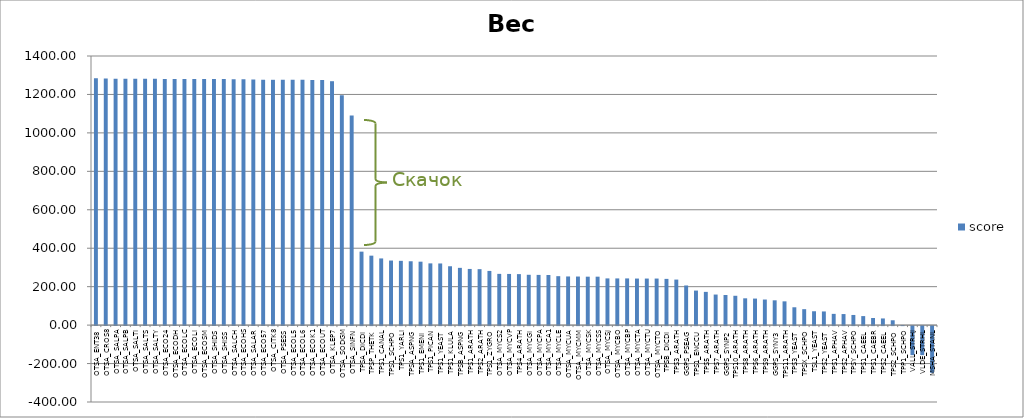
| Category | score |
|---|---|
| OTSA_ENT38 | 1284 |
| OTSA_CROS8 | 1282.5 |
| OTSA_SALPA | 1281.4 |
| OTSA_SALPB | 1281.4 |
| OTSA_SALTI | 1281.4 |
| OTSA_SALTS | 1281.4 |
| OTSA_SALTY | 1281.4 |
| OTSA_ECO24 | 1280.2 |
| OTSA_ECODH | 1280.2 |
| OTSA_ECOLC | 1280.2 |
| OTSA_ECOLI | 1280.2 |
| OTSA_ECOSM | 1280.2 |
| OTSA_SHIDS | 1280.2 |
| OTSA_SHISS | 1280.2 |
| OTSA_SALCH | 1278.8 |
| OTSA_ECOHS | 1278.8 |
| OTSA_SALAR | 1277.3 |
| OTSA_ECO57 | 1276.6 |
| OTSA_CITK8 | 1276.2 |
| OTSA_PSESS | 1275.8 |
| OTSA_ECOL5 | 1275.8 |
| OTSA_ECOL6 | 1275.8 |
| OTSA_ECOK1 | 1274.8 |
| OTSA_ECOUT | 1274.8 |
| OTSA_KLEP7 | 1268.9 |
| OTSA_SODGM | 1196 |
| OTSA_SINFN | 1090.4 |
| TPSA_DICDI | 382.2 |
| TPSP_THETK | 361.3 |
| TPS1_CANAL | 346.9 |
| TPS1_SCHPO | 335.9 |
| TPS1_YARLI | 334.4 |
| TPSA_ASPNG | 332.2 |
| TPS1_EMENI | 330 |
| TPS1_PICAN | 321.2 |
| TPS1_YEAST | 320.7 |
| TPS1_KLULA | 306.2 |
| TPSB_ASPNG | 297.9 |
| TPS1_ARATH | 292.2 |
| TPS2_ARATH | 291.1 |
| TPS1_ZYGRO | 281.9 |
| OTSA_MYCS2 | 266.6 |
| OTSA_MYCVP | 266.2 |
| TPS4_ARATH | 265.3 |
| OTSA_MYCGI | 261.8 |
| OTSA_MYCPA | 261.2 |
| OTSA_MYCA1 | 260.8 |
| OTSA_MYCLE | 254.6 |
| OTSA_MYCUA | 253.1 |
| OTSA_MYCMM | 252.7 |
| OTSA_MYCSK | 252 |
| OTSA_MYCSS | 252 |
| OTSA_MYCSJ | 243 |
| OTSA_MYCBO | 242.9 |
| OTSA_MYCBP | 242.9 |
| OTSA_MYCTA | 242.2 |
| OTSA_MYCTU | 242.2 |
| OTSA_MYCTO | 242.2 |
| TPSB_DICDI | 240.5 |
| TPS3_ARATH | 236.9 |
| GGPS_PSEAG | 206.2 |
| TPS1_ENCCU | 179.7 |
| TPS5_ARATH | 172.9 |
| TPS7_ARATH | 159 |
| GGPS_SYNP2 | 156.6 |
| TPS10_ARATH | 152.6 |
| TPS8_ARATH | 139.4 |
| TPS6_ARATH | 138.1 |
| TPS9_ARATH | 133.1 |
| GGPS_SYNY3 | 129 |
| TPS11_ARATH | 123.6 |
| TPS3_YEAST | 92.8 |
| TPSX_SCHPO | 82.9 |
| TSL1_YEAST | 72.1 |
| TPS2_YEAST | 71.1 |
| TPS1_APHAV | 58.5 |
| TPS2_APHAV | 57.5 |
| TPSY_SCHPO | 52.8 |
| TPS1_CAEEL | 46.9 |
| TPS1_CAEBR | 36.9 |
| TPS2_CAEEL | 34.7 |
| TPS2_SCHPO | 25.2 |
| TPP1_SCHPO | 0.3 |
| VALL_STRHJ | -151.1 |
| VLDE_STRHL | -151.1 |
| MSHA_STANL | -243.1 |